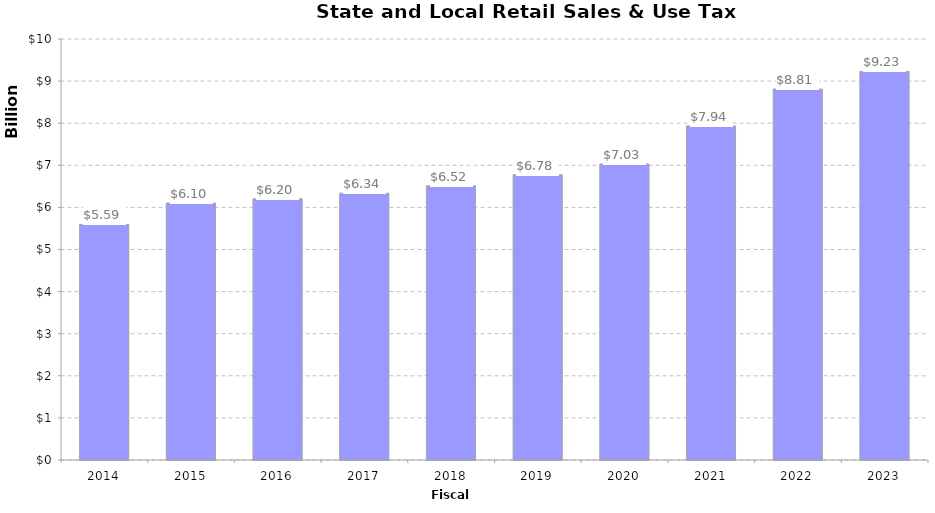
| Category | Series 0 |
|---|---|
| 2014.0 | 5594644000 |
| 2015.0 | 6102277000 |
| 2016.0 | 6204518000 |
| 2017.0 | 6337800000 |
| 2018.0 | 6515598000 |
| 2019.0 | 6776635000 |
| 2020.0 | 7029632000 |
| 2021.0 | 7935765000 |
| 2022.0 | 8810274000 |
| 2023.0 | 9229041000 |